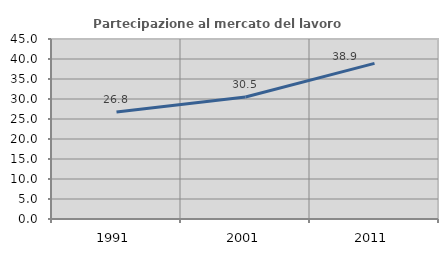
| Category | Partecipazione al mercato del lavoro  femminile |
|---|---|
| 1991.0 | 26.753 |
| 2001.0 | 30.503 |
| 2011.0 | 38.899 |